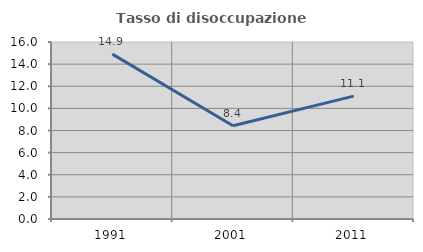
| Category | Tasso di disoccupazione giovanile  |
|---|---|
| 1991.0 | 14.907 |
| 2001.0 | 8.434 |
| 2011.0 | 11.111 |